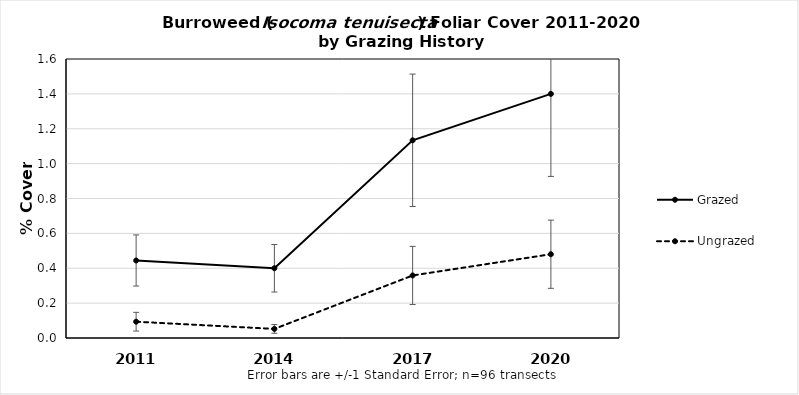
| Category | Grazed | Ungrazed |
|---|---|---|
| 2011.0 | 0.445 | 0.093 |
| 2014.0 | 0.4 | 0.052 |
| 2017.0 | 1.134 | 0.359 |
| 2020.0 | 1.4 | 0.48 |